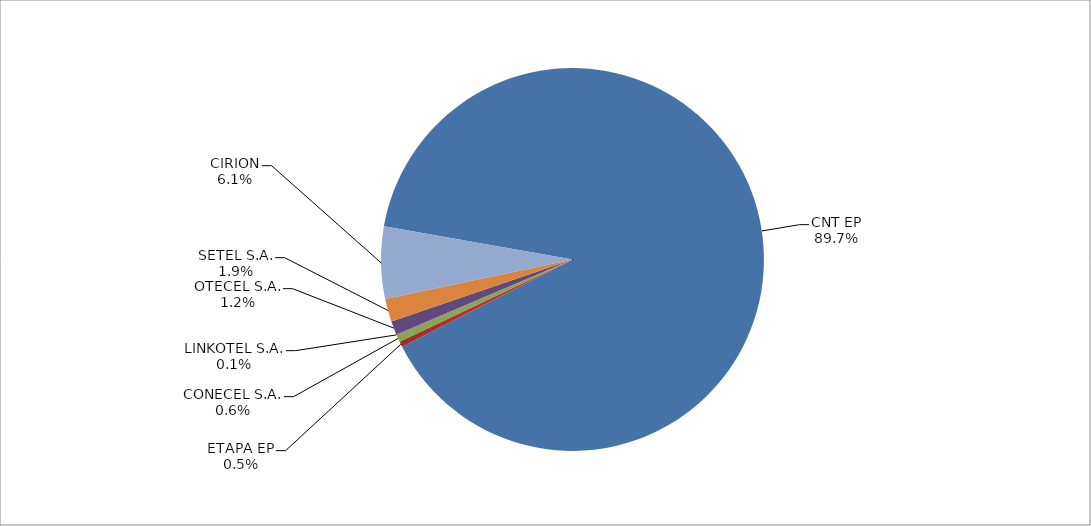
| Category | Series 0 |
|---|---|
| CNT EP | 3017 |
| ETAPA EP | 16 |
| CONECEL S.A. | 20 |
| LINKOTEL S.A. | 2 |
| OTECEL S.A. | 39 |
| SETEL S.A. | 65 |
| CIRION | 205 |